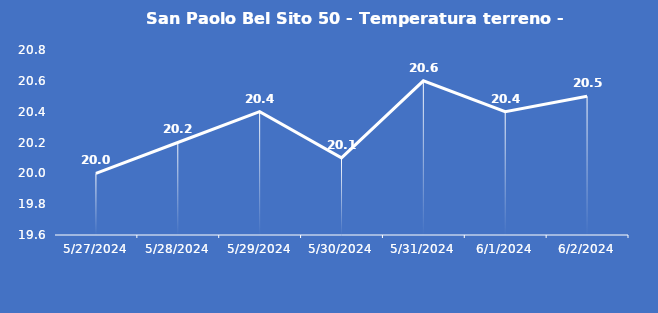
| Category | San Paolo Bel Sito 50 - Temperatura terreno - Grezzo (°C) |
|---|---|
| 5/27/24 | 20 |
| 5/28/24 | 20.2 |
| 5/29/24 | 20.4 |
| 5/30/24 | 20.1 |
| 5/31/24 | 20.6 |
| 6/1/24 | 20.4 |
| 6/2/24 | 20.5 |